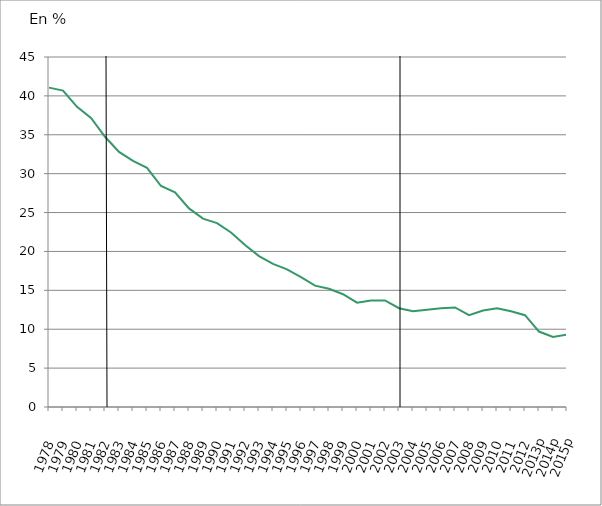
| Category | Series 0 |
|---|---|
| 1978 | 41.064 |
| 1979 | 40.681 |
| 1980 | 38.593 |
| 1981 | 37.16 |
| 1982 | 34.747 |
| 1983 | 32.792 |
| 1984 | 31.638 |
| 1985 | 30.754 |
| 1986 | 28.411 |
| 1987 | 27.586 |
| 1988 | 25.532 |
| 1989 | 24.215 |
| 1990 | 23.642 |
| 1991 | 22.445 |
| 1992 | 20.821 |
| 1993 | 19.4 |
| 1994 | 18.4 |
| 1995 | 17.7 |
| 1996 | 16.7 |
| 1997 | 15.6 |
| 1998 | 15.2 |
| 1999 | 14.5 |
| 2000 | 13.413 |
| 2001 | 13.7 |
| 2002 | 13.7 |
| 2003 | 12.7 |
| 2004 | 12.3 |
| 2005 | 12.5 |
| 2006 | 12.7 |
| 2007 | 12.8 |
| 2008 | 11.8 |
| 2009 | 12.4 |
| 2010 | 12.7 |
| 2011 | 12.3 |
| 2012 | 11.8 |
| 2013p | 9.7 |
| 2014p | 9 |
| 2015p | 9.3 |